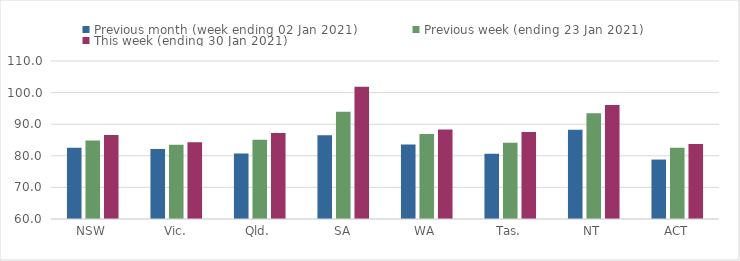
| Category | Previous month (week ending 02 Jan 2021) | Previous week (ending 23 Jan 2021) | This week (ending 30 Jan 2021) |
|---|---|---|---|
| NSW | 82.54 | 84.86 | 86.58 |
| Vic. | 82.19 | 83.52 | 84.25 |
| Qld. | 80.73 | 85.11 | 87.24 |
| SA | 86.48 | 93.97 | 101.89 |
| WA | 83.61 | 86.91 | 88.31 |
| Tas. | 80.68 | 84.14 | 87.5 |
| NT | 88.25 | 93.49 | 96.08 |
| ACT | 78.81 | 82.51 | 83.74 |